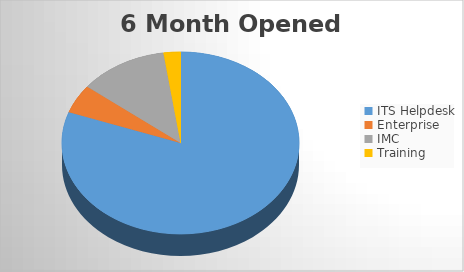
| Category | 6M Opened |
|---|---|
| ITS Helpdesk | 1496 |
| Enterprise | 95 |
| IMC | 225 |
| Training | 43 |